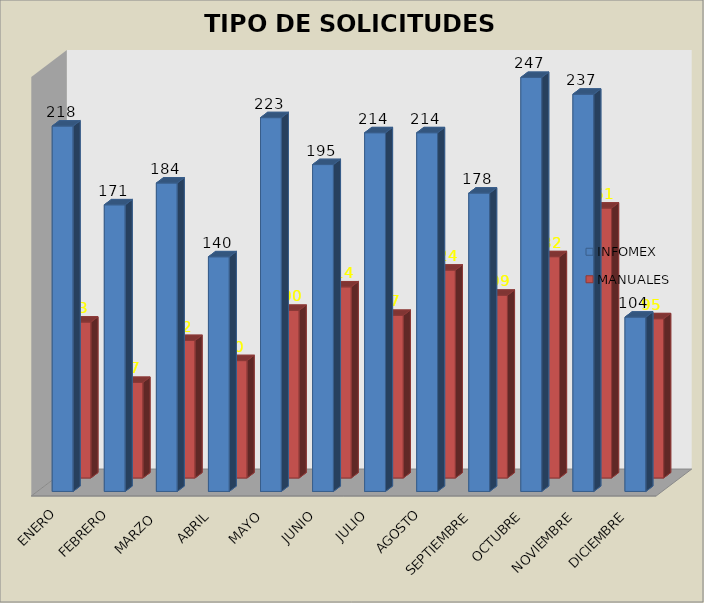
| Category | INFOMEX | MANUALES |
|---|---|---|
| ENERO | 218 | 93 |
| FEBRERO | 171 | 57 |
| MARZO  | 184 | 82 |
| ABRIL | 140 | 70 |
| MAYO | 223 | 100 |
| JUNIO | 195 | 114 |
| JULIO | 214 | 97 |
| AGOSTO | 214 | 124 |
| SEPTIEMBRE | 178 | 109 |
| OCTUBRE | 247 | 132 |
| NOVIEMBRE | 237 | 161 |
| DICIEMBRE | 104 | 95 |